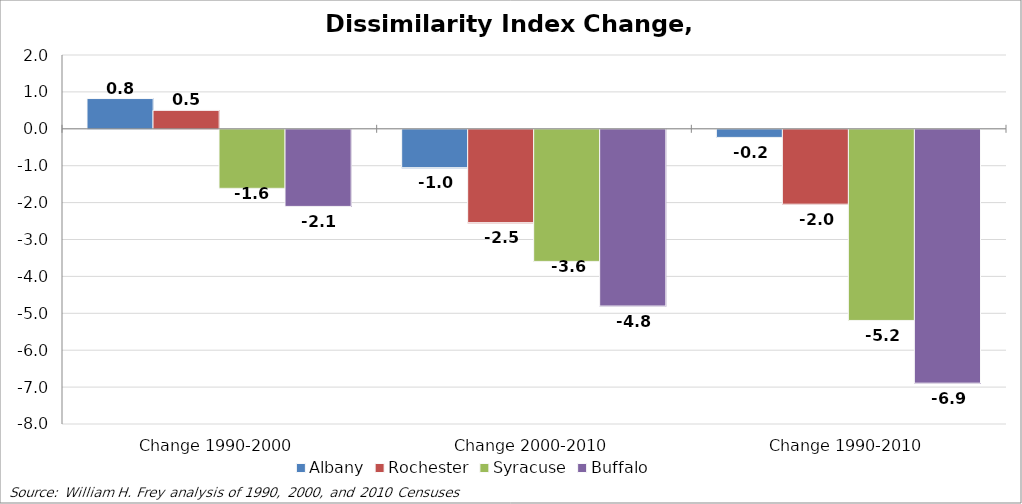
| Category | Albany | Rochester | Syracuse | Buffalo |
|---|---|---|---|---|
| Change 1990-2000 | 0.82 | 0.5 | -1.6 | -2.09 |
| Change 2000-2010 | -1.04 | -2.53 | -3.58 | -4.79 |
| Change 1990-2010 | -0.22 | -2.03 | -5.18 | -6.88 |